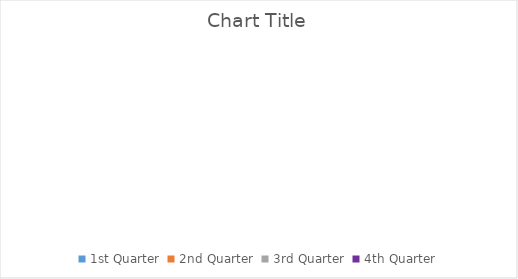
| Category | 1st Quarter | 2nd Quarter | 3rd Quarter | 4th Quarter |
|---|---|---|---|---|
| Alice Mutton | 2667.6 | 4013.1 | 4836 | 6087.9 |
| Boston Crab Meat | 1768.41 | 1978 | 4412.32 | 1656 |
| Camembert Pierrot | 3182.4 | 4683.5 | 9579.5 | 3060 |
| Ipoh Coffee | 1398.4 | 4496.5 | 1196 | 3979 |
| Louisiana Fiery Hot Pepper Sauce | 1347.36 | 2750.69 | 1375.62 | 3899.51 |
| Louisiana Hot Spiced Okra | 1509.6 | 530.4 | 68 | 850 |
| Mozzarella di Giovanni | 1390 | 4488.2 | 3027.6 | 2697 |
| Sir Rodney's Scones | 1462 | 644 | 1733 | 1434 |
| Steeleye Stout | 1310.4 | 1368 | 1323 | 1273.5 |
| Veggie-spread | 3202.87 | 263.4 | 842.88 | 2590.1 |